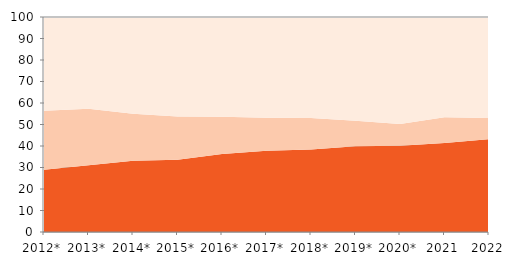
| Category | Запослени | Незапослени | Становништво ван радне снаге |
|---|---|---|---|
| 2012* | 28.933 | 27.449 | 60.121 |
| 2013* | 31.02 | 26.254 | 57.937 |
| 2014* | 33.188 | 21.789 | 57.566 |
| 2015* | 33.569 | 20.14 | 57.965 |
| 2016* | 36.251 | 17.321 | 56.155 |
| 2017* | 37.733 | 15.385 | 55.407 |
| 2018* | 38.335 | 14.745 | 55.035 |
| 2019* | 39.834 | 11.956 | 54.756 |
| 2020* | 40.069 | 10.188 | 55.385 |
| 2021 | 41.345 | 12.066 | 52.981 |
| 2022 | 43.2 | 9.8 | 52.1 |